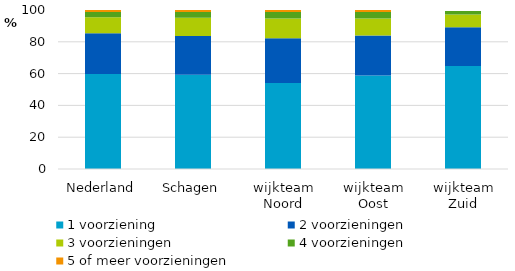
| Category | 1 voorziening | 2 voorzieningen | 3 voorzieningen | 4 voorzieningen | 5 of meer voorzieningen |
|---|---|---|---|---|---|
| Nederland | 59.7 | 25.7 | 10 | 3.4 | 1.2 |
| Schagen | 59.2 | 24.5 | 11.4 | 3.6 | 1.3 |
| wijkteam Noord | 54.1 | 28.1 | 12.5 | 4.1 | 1.2 |
| wijkteam Oost | 58.8 | 25.2 | 10.7 | 4 | 1.3 |
| wijkteam Zuid | 64.8 | 24.3 | 8.1 | 2.1 | 0 |